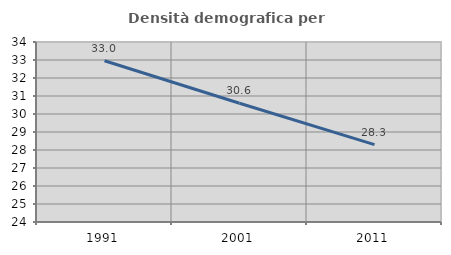
| Category | Densità demografica |
|---|---|
| 1991.0 | 32.961 |
| 2001.0 | 30.594 |
| 2011.0 | 28.3 |